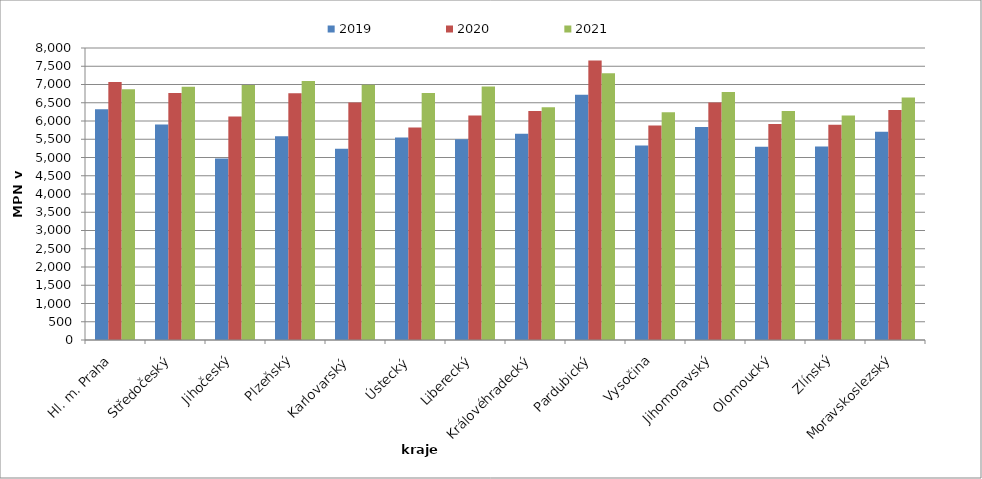
| Category | 2019 | 2020 | 2021 |
|---|---|---|---|
| Hl. m. Praha | 6320 | 7071 | 6867 |
| Středočeský | 5907 | 6766 | 6937 |
| Jihočeský | 4973 | 6121 | 6987 |
| Plzeňský | 5585 | 6760 | 7098 |
| Karlovarský  | 5238 | 6504 | 6994 |
| Ústecký   | 5548 | 5819 | 6767 |
| Liberecký | 5501 | 6150 | 6946 |
| Královéhradecký | 5653 | 6274 | 6374 |
| Pardubický | 6717 | 7656 | 7309 |
| Vysočina | 5327 | 5878 | 6238 |
| Jihomoravský | 5837 | 6509 | 6792 |
| Olomoucký | 5295 | 5920 | 6275 |
| Zlínský | 5300 | 5895 | 6154 |
| Moravskoslezský | 5708 | 6304 | 6641 |